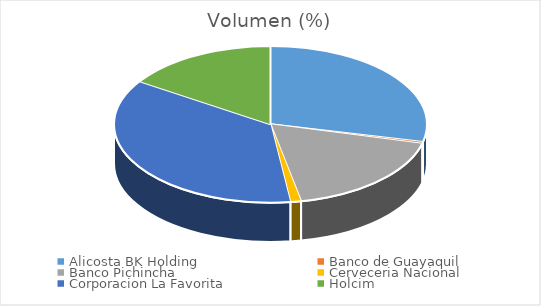
| Category | Volumen |
|---|---|
| Alicosta BK Holding | 12000 |
| Banco de Guayaquil | 145 |
| Banco Pichincha | 7500 |
| Cerveceria Nacional | 466.56 |
| Corporacion La Favorita | 15201.6 |
| Holcim | 6600 |